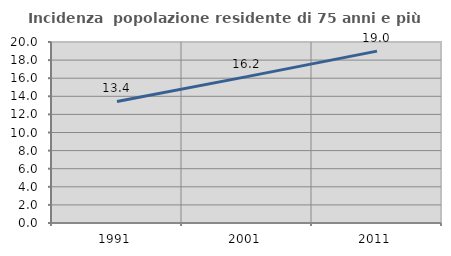
| Category | Incidenza  popolazione residente di 75 anni e più |
|---|---|
| 1991.0 | 13.435 |
| 2001.0 | 16.174 |
| 2011.0 | 18.994 |